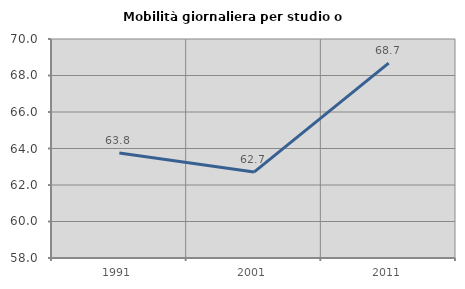
| Category | Mobilità giornaliera per studio o lavoro |
|---|---|
| 1991.0 | 63.752 |
| 2001.0 | 62.707 |
| 2011.0 | 68.679 |